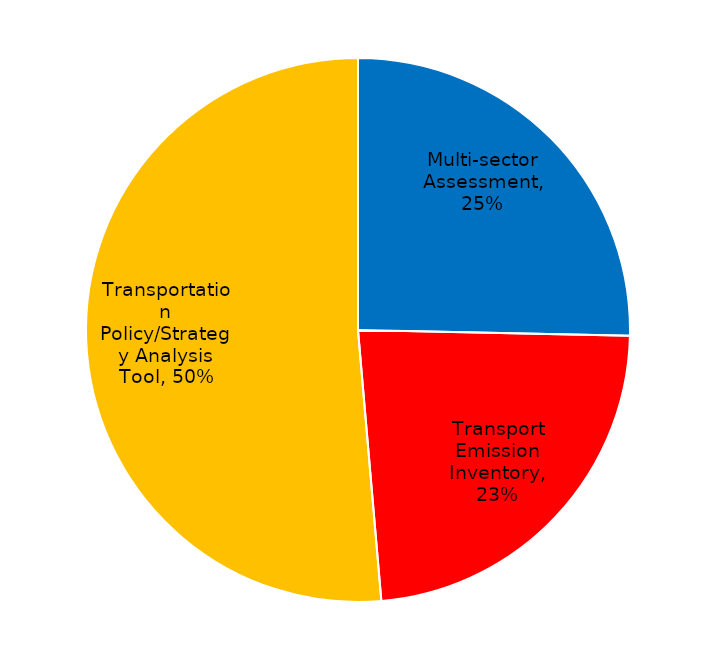
| Category | Series 0 |
|---|---|
| Government | 56 |
| Development Agency | 57 |
| Private Sector | 12 |
| NGO/University | 25 |